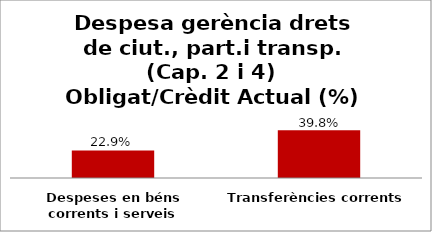
| Category | Series 0 |
|---|---|
| Despeses en béns corrents i serveis | 0.229 |
| Transferències corrents | 0.398 |